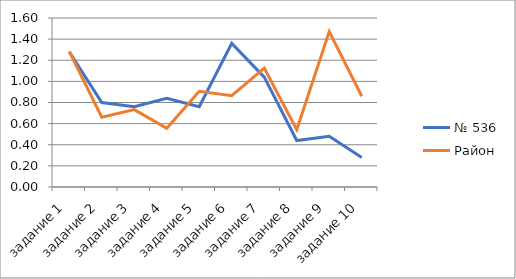
| Category | № 536 | Район |
|---|---|---|
| задание 1 | 1.28 | 1.284 |
| задание 2 | 0.8 | 0.661 |
| задание 3 | 0.76 | 0.733 |
| задание 4 | 0.84 | 0.555 |
| задание 5 | 0.76 | 0.906 |
| задание 6 | 1.36 | 0.865 |
| задание 7 | 1.04 | 1.127 |
| задание 8 | 0.44 | 0.543 |
| задание 9 | 0.48 | 1.472 |
| задание 10 | 0.28 | 0.859 |